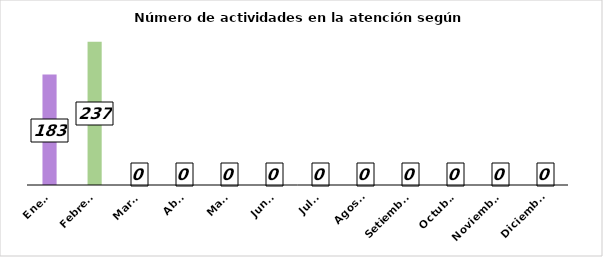
| Category | Series 0 |
|---|---|
| Enero | 183 |
| Febrero | 237 |
| Marzo | 0 |
| Abril | 0 |
| Mayo | 0 |
| Junio | 0 |
| Julio | 0 |
| Agosto | 0 |
| Setiembre | 0 |
| Octubre | 0 |
| Noviembre | 0 |
| Diciembre | 0 |